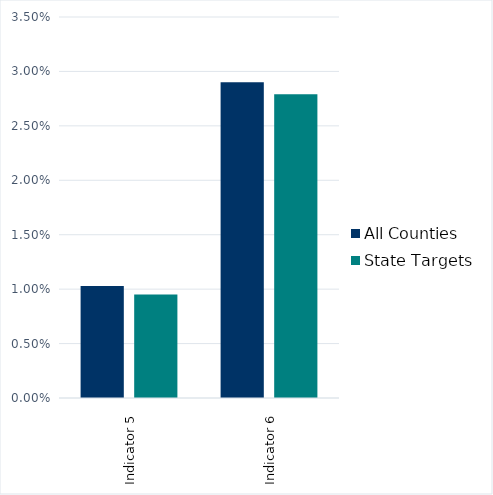
| Category | All Counties | State Targets |
|---|---|---|
| Indicator 5 | 0.01 | 0.01 |
| Indicator 6 | 0.029 | 0.028 |